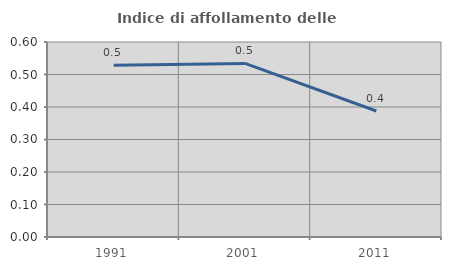
| Category | Indice di affollamento delle abitazioni  |
|---|---|
| 1991.0 | 0.528 |
| 2001.0 | 0.534 |
| 2011.0 | 0.388 |